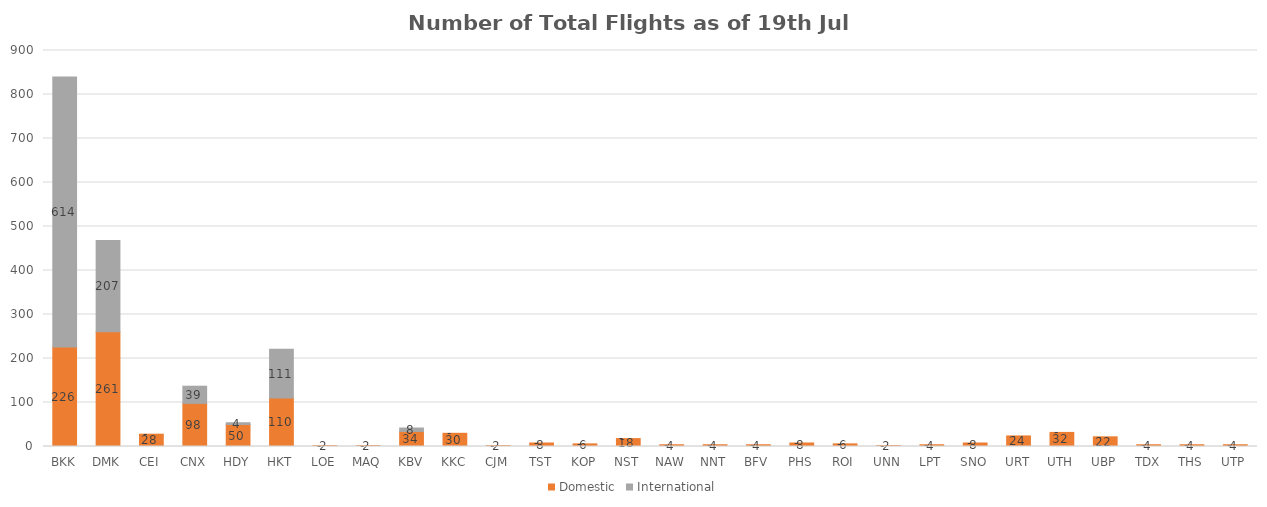
| Category | Domestic | International |
|---|---|---|
| BKK | 226 | 614 |
| DMK | 261 | 207 |
| CEI | 28 | 0 |
| CNX | 98 | 39 |
| HDY | 50 | 4 |
| HKT | 110 | 111 |
| LOE | 2 | 0 |
| MAQ | 2 | 0 |
| KBV | 34 | 8 |
| KKC | 30 | 0 |
| CJM | 2 | 0 |
| TST | 8 | 0 |
| KOP | 6 | 0 |
| NST | 18 | 0 |
| NAW | 4 | 0 |
| NNT | 4 | 0 |
| BFV | 4 | 0 |
| PHS | 8 | 0 |
| ROI | 6 | 0 |
| UNN | 2 | 0 |
| LPT | 4 | 0 |
| SNO | 8 | 0 |
| URT | 24 | 0 |
| UTH | 32 | 0 |
| UBP | 22 | 0 |
| TDX | 4 | 0 |
| THS | 4 | 0 |
| UTP | 4 | 0 |